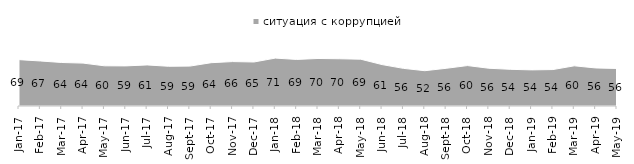
| Category | ситуация с коррупцией |
|---|---|
| 2017-01-01 | 68.7 |
| 2017-02-01 | 66.7 |
| 2017-03-01 | 64.45 |
| 2017-04-01 | 63.55 |
| 2017-05-01 | 59.55 |
| 2017-06-01 | 59.4 |
| 2017-07-01 | 60.85 |
| 2017-08-01 | 58.85 |
| 2017-09-01 | 59.1 |
| 2017-10-01 | 64.15 |
| 2017-11-01 | 65.8 |
| 2017-12-01 | 65.2 |
| 2018-01-01 | 70.95 |
| 2018-02-01 | 69 |
| 2018-03-01 | 70.4 |
| 2018-04-01 | 70 |
| 2018-05-01 | 69.35 |
| 2018-06-01 | 61.35 |
| 2018-07-01 | 55.75 |
| 2018-08-01 | 52.3 |
| 2018-09-01 | 55.85 |
| 2018-10-01 | 59.9 |
| 2018-11-01 | 55.938 |
| 2018-12-01 | 54.35 |
| 2019-01-01 | 53.5 |
| 2019-02-01 | 54 |
| 2019-03-01 | 59.523 |
| 2019-04-01 | 56.386 |
| 2019-05-01 | 55.622 |